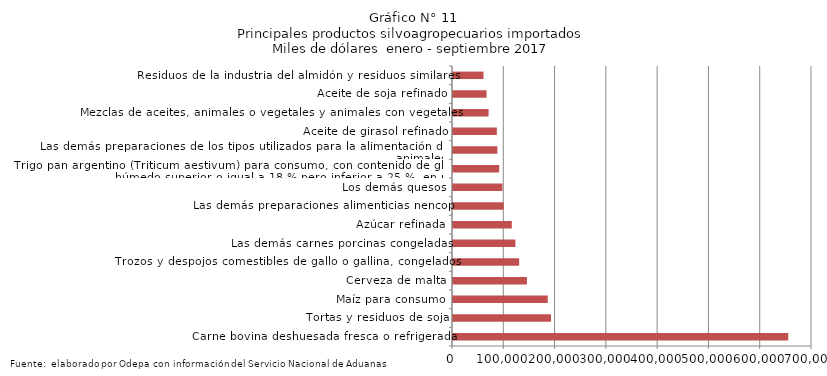
| Category | Series 0 |
|---|---|
| Carne bovina deshuesada fresca o refrigerada | 653720.348 |
| Tortas y residuos de soja | 191045.397 |
| Maíz para consumo | 184769.923 |
| Cerveza de malta | 144197.595 |
| Trozos y despojos comestibles de gallo o gallina, congelados | 129008.653 |
| Las demás carnes porcinas congeladas | 121712.951 |
| Azúcar refinada | 114623.802 |
| Las demás preparaciones alimenticias nencop | 98824.637 |
| Los demás quesos | 96449.301 |
| Trigo pan argentino (Triticum aestivum) para consumo, con contenido de gluten húmedo superior o igual a 18 % pero inferior a 25 %, en peso | 90041.284 |
| Las demás preparaciones de los tipos utilizados para la alimentación de los animales | 86542.652 |
| Aceite de girasol refinado | 85482.805 |
| Mezclas de aceites, animales o vegetales y animales con vegetales | 69372.106 |
| Aceite de soja refinado | 65377.888 |
| Residuos de la industria del almidón y residuos similares | 59447.144 |